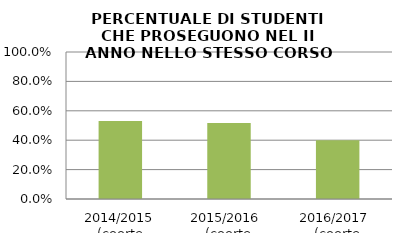
| Category | 2014/2015 (coorte 2013/14) 2015/2016  (coorte 2014/15) 2016/2017  (coorte 2015/16) |
|---|---|
| 2014/2015 (coorte 2013/14) | 0.53 |
| 2015/2016  (coorte 2014/15) | 0.518 |
| 2016/2017  (coorte 2015/16) | 0.4 |